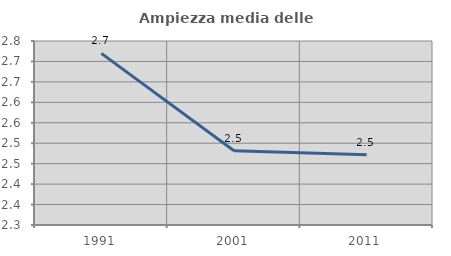
| Category | Ampiezza media delle famiglie |
|---|---|
| 1991.0 | 2.72 |
| 2001.0 | 2.482 |
| 2011.0 | 2.472 |